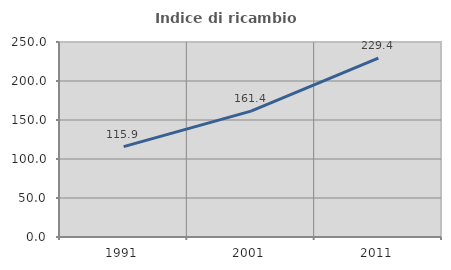
| Category | Indice di ricambio occupazionale  |
|---|---|
| 1991.0 | 115.89 |
| 2001.0 | 161.364 |
| 2011.0 | 229.433 |